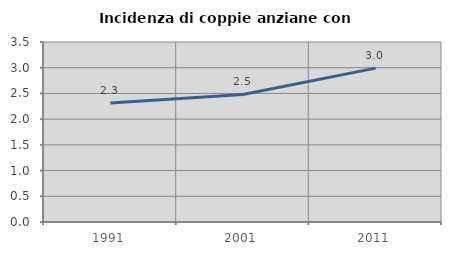
| Category | Incidenza di coppie anziane con figli |
|---|---|
| 1991.0 | 2.312 |
| 2001.0 | 2.479 |
| 2011.0 | 2.993 |